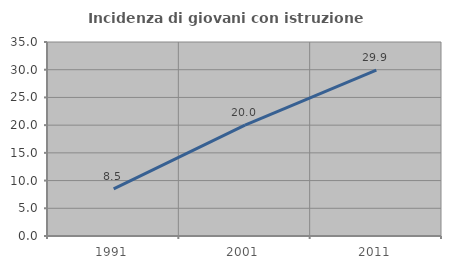
| Category | Incidenza di giovani con istruzione universitaria |
|---|---|
| 1991.0 | 8.513 |
| 2001.0 | 20 |
| 2011.0 | 29.938 |